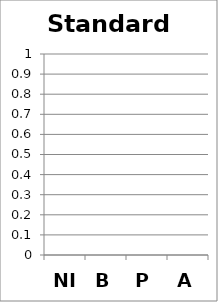
| Category | Standard 12 |
|---|---|
| NI | 0 |
| B | 0 |
| P | 0 |
| A | 0 |